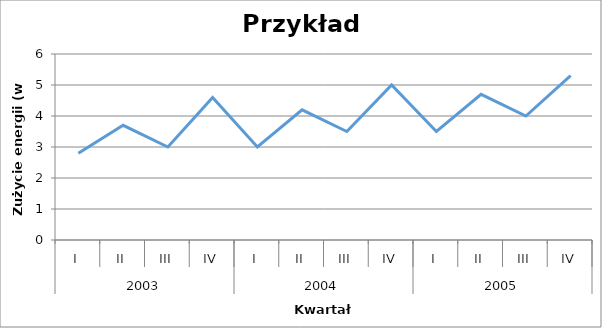
| Category | Series 0 |
|---|---|
| 0 | 2.8 |
| 1 | 3.7 |
| 2 | 3 |
| 3 | 4.6 |
| 4 | 3 |
| 5 | 4.2 |
| 6 | 3.5 |
| 7 | 5 |
| 8 | 3.5 |
| 9 | 4.7 |
| 10 | 4 |
| 11 | 5.3 |